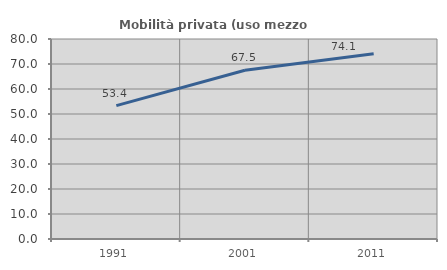
| Category | Mobilità privata (uso mezzo privato) |
|---|---|
| 1991.0 | 53.355 |
| 2001.0 | 67.517 |
| 2011.0 | 74.074 |